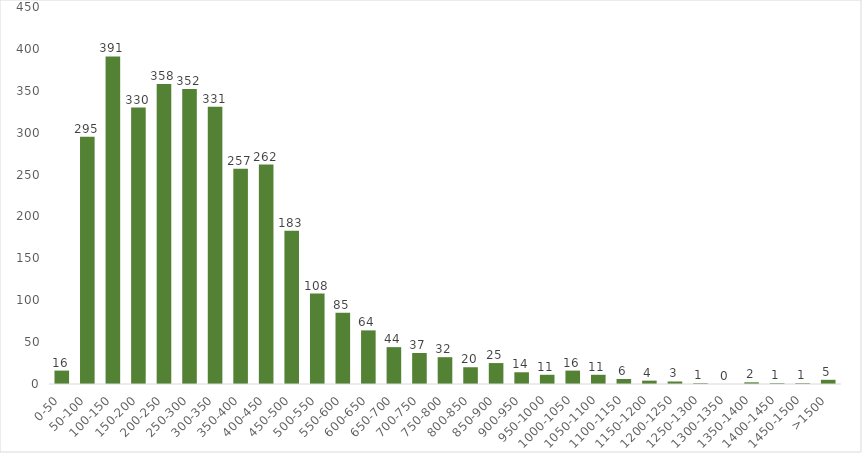
| Category | Series 0 |
|---|---|
| 0-50 | 16 |
| 50-100 | 295 |
| 100-150 | 391 |
| 150-200 | 330 |
| 200-250 | 358 |
| 250-300 | 352 |
| 300-350 | 331 |
| 350-400 | 257 |
| 400-450 | 262 |
| 450-500 | 183 |
| 500-550 | 108 |
| 550-600 | 85 |
| 600-650 | 64 |
| 650-700 | 44 |
| 700-750 | 37 |
| 750-800 | 32 |
| 800-850 | 20 |
| 850-900 | 25 |
| 900-950 | 14 |
| 950-1000 | 11 |
| 1000-1050 | 16 |
| 1050-1100 | 11 |
| 1100-1150 | 6 |
| 1150-1200 | 4 |
| 1200-1250 | 3 |
| 1250-1300 | 1 |
| 1300-1350 | 0 |
| 1350-1400 | 2 |
| 1400-1450 | 1 |
| 1450-1500 | 1 |
| >1500 | 5 |